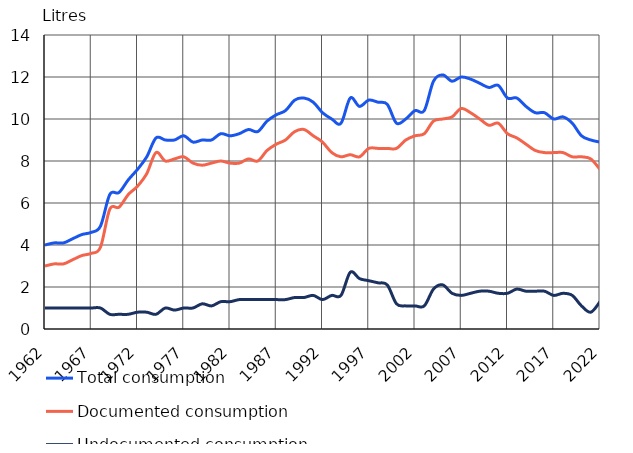
| Category | Total consumption | Documented consumption | Undocumented consumption 1) |
|---|---|---|---|
| 1962.0 | 4 | 3 | 1 |
| 1963.0 | 4.1 | 3.1 | 1 |
| 1964.0 | 4.1 | 3.1 | 1 |
| 1965.0 | 4.3 | 3.3 | 1 |
| 1966.0 | 4.5 | 3.5 | 1 |
| 1967.0 | 4.6 | 3.6 | 1 |
| 1968.0 | 4.9 | 3.9 | 1 |
| 1969.0 | 6.4 | 5.7 | 0.7 |
| 1970.0 | 6.5 | 5.8 | 0.7 |
| 1971.0 | 7.1 | 6.4 | 0.7 |
| 1972.0 | 7.6 | 6.8 | 0.8 |
| 1973.0 | 8.2 | 7.4 | 0.8 |
| 1974.0 | 9.1 | 8.4 | 0.7 |
| 1975.0 | 9 | 8 | 1 |
| 1976.0 | 9 | 8.1 | 0.9 |
| 1977.0 | 9.2 | 8.2 | 1 |
| 1978.0 | 8.9 | 7.9 | 1 |
| 1979.0 | 9 | 7.8 | 1.2 |
| 1980.0 | 9 | 7.9 | 1.1 |
| 1981.0 | 9.3 | 8 | 1.3 |
| 1982.0 | 9.2 | 7.9 | 1.3 |
| 1983.0 | 9.3 | 7.9 | 1.4 |
| 1984.0 | 9.5 | 8.1 | 1.4 |
| 1985.0 | 9.4 | 8 | 1.4 |
| 1986.0 | 9.9 | 8.5 | 1.4 |
| 1987.0 | 10.2 | 8.8 | 1.4 |
| 1988.0 | 10.4 | 9 | 1.4 |
| 1989.0 | 10.9 | 9.4 | 1.5 |
| 1990.0 | 11 | 9.5 | 1.5 |
| 1991.0 | 10.8 | 9.2 | 1.6 |
| 1992.0 | 10.3 | 8.9 | 1.4 |
| 1993.0 | 10 | 8.4 | 1.6 |
| 1994.0 | 9.8 | 8.2 | 1.6 |
| 1995.0 | 11 | 8.3 | 2.7 |
| 1996.0 | 10.6 | 8.2 | 2.4 |
| 1997.0 | 10.9 | 8.6 | 2.3 |
| 1998.0 | 10.8 | 8.6 | 2.2 |
| 1999.0 | 10.7 | 8.6 | 2.1 |
| 2000.0 | 9.8 | 8.6 | 1.2 |
| 2001.0 | 10 | 9 | 1.1 |
| 2002.0 | 10.4 | 9.2 | 1.1 |
| 2003.0 | 10.4 | 9.3 | 1.1 |
| 2004.0 | 11.8 | 9.9 | 1.9 |
| 2005.0 | 12.1 | 10 | 2.1 |
| 2006.0 | 11.8 | 10.1 | 1.7 |
| 2007.0 | 12 | 10.5 | 1.6 |
| 2008.0 | 11.9 | 10.3 | 1.7 |
| 2009.0 | 11.7 | 10 | 1.8 |
| 2010.0 | 11.5 | 9.7 | 1.8 |
| 2011.0 | 11.6 | 9.8 | 1.7 |
| 2012.0 | 11 | 9.3 | 1.7 |
| 2013.0 | 11 | 9.1 | 1.9 |
| 2014.0 | 10.6 | 8.8 | 1.8 |
| 2015.0 | 10.3 | 8.5 | 1.8 |
| 2016.0 | 10.3 | 8.4 | 1.8 |
| 2017.0 | 10 | 8.4 | 1.6 |
| 2018.0 | 10.1 | 8.4 | 1.7 |
| 2019.0 | 9.8 | 8.2 | 1.6 |
| 2020.0 | 9.2 | 8.2 | 1.1 |
| 2021.0 | 9 | 8.1 | 0.8 |
| 2022.0 | 8.9 | 7.6 | 1.3 |